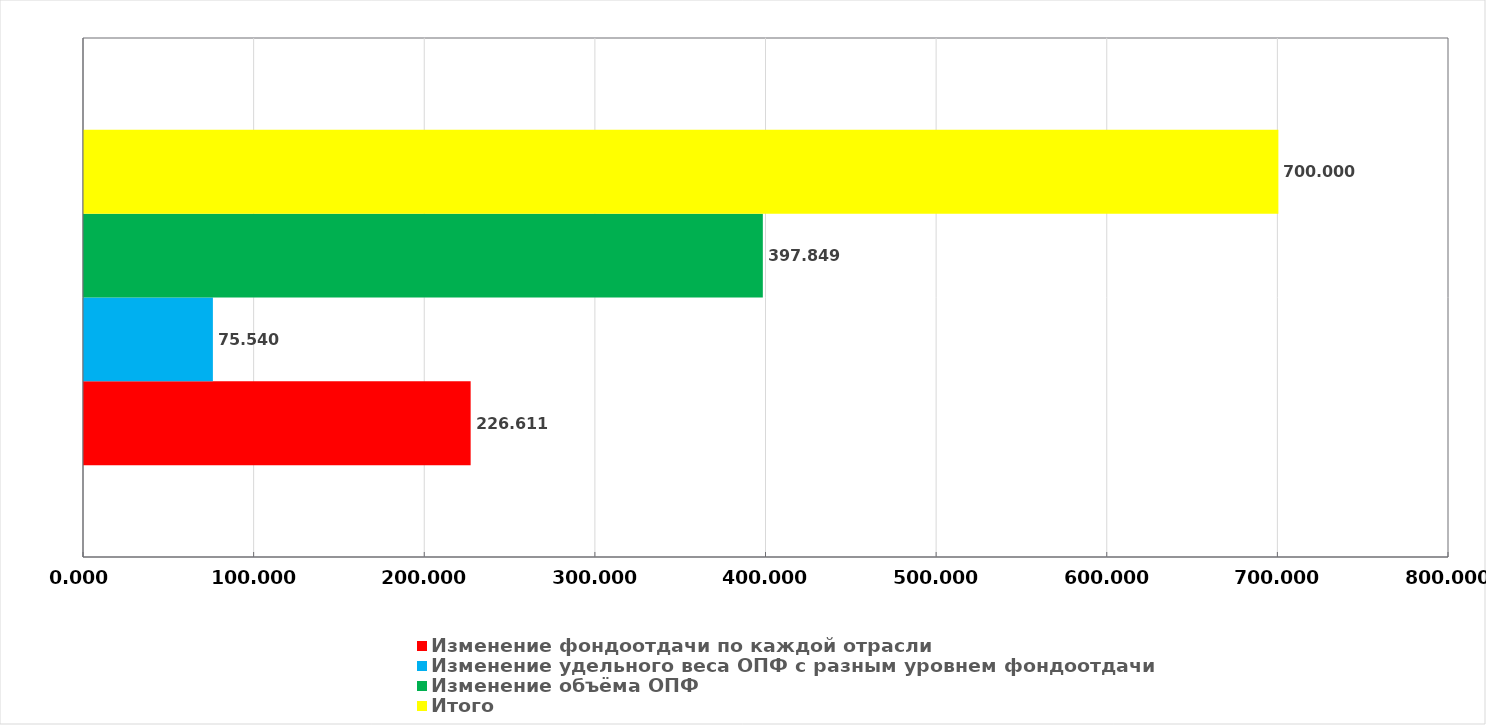
| Category | Изменение фондоотдачи по каждой отрасли | Изменение удельного веса ОПФ с разным уровнем фондоотдачи | Изменение объёма ОПФ | Итого |
|---|---|---|---|---|
| 0 | 226.611 | 75.54 | 397.849 | 700 |